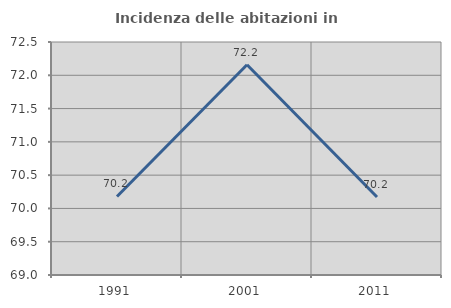
| Category | Incidenza delle abitazioni in proprietà  |
|---|---|
| 1991.0 | 70.18 |
| 2001.0 | 72.157 |
| 2011.0 | 70.173 |